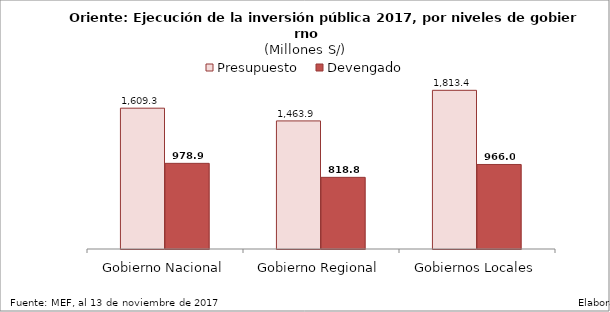
| Category | Presupuesto | Devengado |
|---|---|---|
| Gobierno Nacional | 1609.294 | 978.928 |
| Gobierno Regional | 1463.885 | 818.849 |
| Gobiernos Locales | 1813.426 | 965.996 |